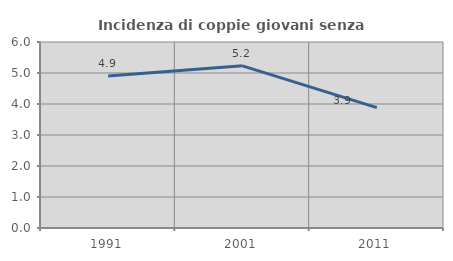
| Category | Incidenza di coppie giovani senza figli |
|---|---|
| 1991.0 | 4.906 |
| 2001.0 | 5.231 |
| 2011.0 | 3.881 |